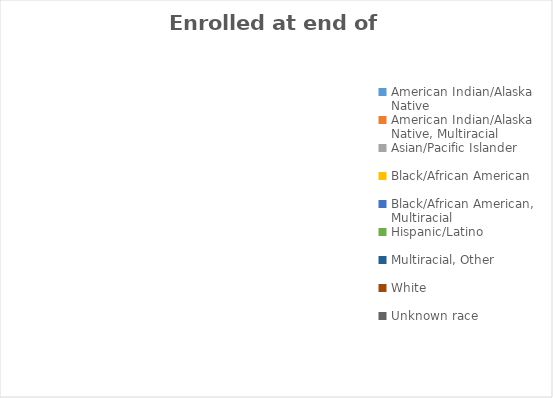
| Category | Enrolled at end of period |
|---|---|
| American Indian/Alaska Native  | 0 |
| American Indian/Alaska Native, Multiracial | 0 |
| Asian/Pacific Islander | 0 |
| Black/African American | 0 |
| Black/African American, Multiracial | 0 |
| Hispanic/Latino  | 0 |
| Multiracial, Other | 0 |
| White  | 0 |
| Unknown race | 0 |